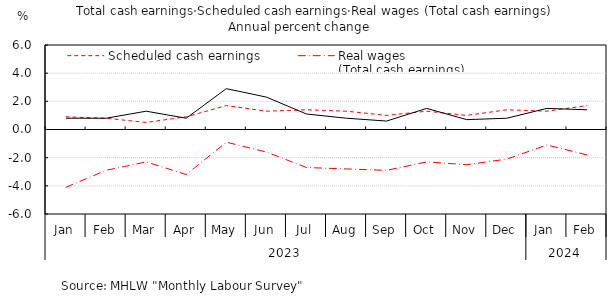
| Category | Scheduled cash earnings | Real wages
(Total cash earnings) | Total cash earnings |
|---|---|---|---|
| 0 | 0.9 | -4.1 | 0.8 |
| 1 | 0.8 | -2.9 | 0.8 |
| 2 | 0.5 | -2.3 | 1.3 |
| 3 | 0.9 | -3.2 | 0.8 |
| 4 | 1.7 | -0.9 | 2.9 |
| 5 | 1.3 | -1.6 | 2.3 |
| 6 | 1.4 | -2.7 | 1.1 |
| 7 | 1.3 | -2.8 | 0.8 |
| 8 | 1 | -2.9 | 0.6 |
| 9 | 1.3 | -2.3 | 1.5 |
| 10 | 1 | -2.5 | 0.7 |
| 11 | 1.4 | -2.1 | 0.8 |
| 12 | 1.3 | -1.1 | 1.5 |
| 13 | 1.7 | -1.8 | 1.4 |